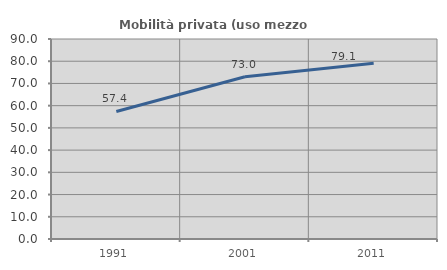
| Category | Mobilità privata (uso mezzo privato) |
|---|---|
| 1991.0 | 57.392 |
| 2001.0 | 72.998 |
| 2011.0 | 79.127 |